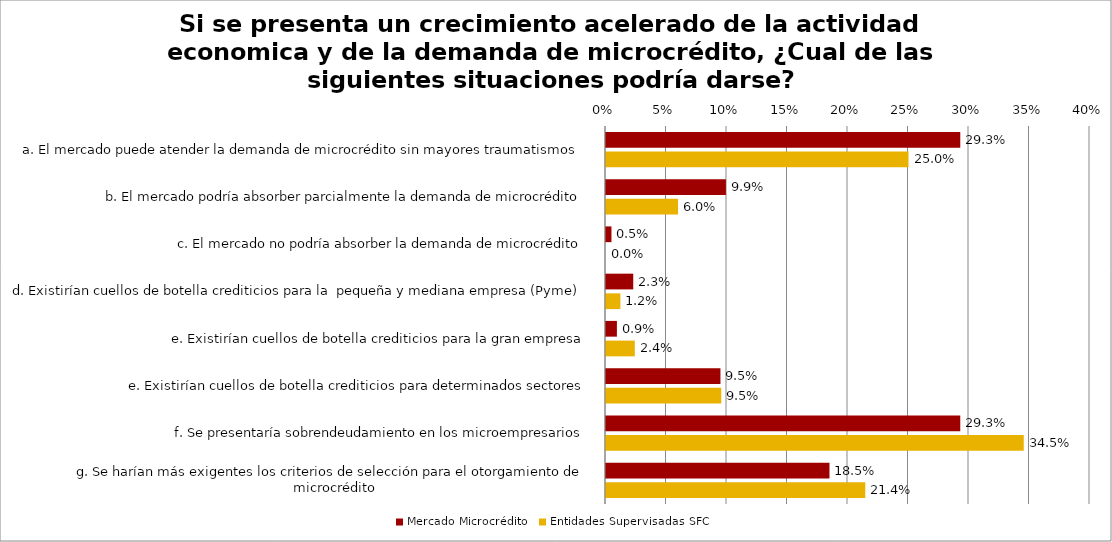
| Category | Mercado Microcrédito | Entidades Supervisadas SFC |
|---|---|---|
| a. El mercado puede atender la demanda de microcrédito sin mayores traumatismos | 0.293 | 0.25 |
| b. El mercado podría absorber parcialmente la demanda de microcrédito | 0.099 | 0.06 |
| c. El mercado no podría absorber la demanda de microcrédito | 0.005 | 0 |
| d. Existirían cuellos de botella crediticios para la  pequeña y mediana empresa (Pyme) | 0.023 | 0.012 |
| e. Existirían cuellos de botella crediticios para la gran empresa | 0.009 | 0.024 |
| e. Existirían cuellos de botella crediticios para determinados sectores | 0.095 | 0.095 |
| f. Se presentaría sobrendeudamiento en los microempresarios | 0.293 | 0.345 |
| g. Se harían más exigentes los criterios de selección para el otorgamiento de microcrédito | 0.185 | 0.214 |